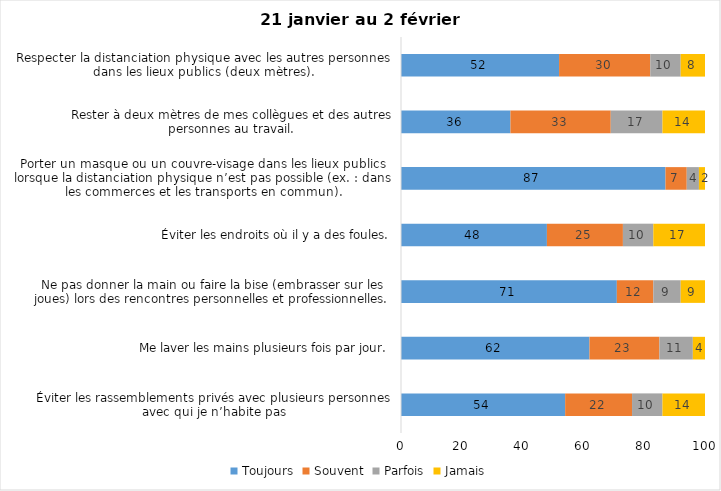
| Category | Toujours | Souvent | Parfois | Jamais |
|---|---|---|---|---|
| Éviter les rassemblements privés avec plusieurs personnes avec qui je n’habite pas | 54 | 22 | 10 | 14 |
| Me laver les mains plusieurs fois par jour. | 62 | 23 | 11 | 4 |
| Ne pas donner la main ou faire la bise (embrasser sur les joues) lors des rencontres personnelles et professionnelles. | 71 | 12 | 9 | 9 |
| Éviter les endroits où il y a des foules. | 48 | 25 | 10 | 17 |
| Porter un masque ou un couvre-visage dans les lieux publics lorsque la distanciation physique n’est pas possible (ex. : dans les commerces et les transports en commun). | 87 | 7 | 4 | 2 |
| Rester à deux mètres de mes collègues et des autres personnes au travail. | 36 | 33 | 17 | 14 |
| Respecter la distanciation physique avec les autres personnes dans les lieux publics (deux mètres). | 52 | 30 | 10 | 8 |